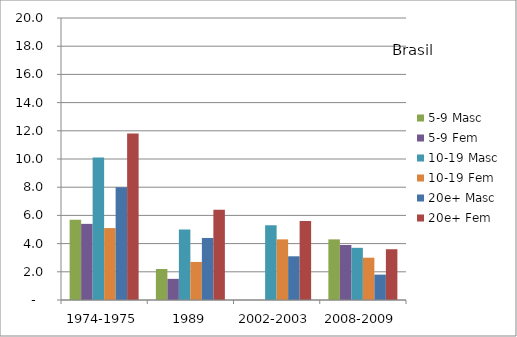
| Category | 5-9 Masc | 5-9 Fem | 10-19 Masc | 10-19 Fem | 20e+ Masc | 20e+ Fem |
|---|---|---|---|---|---|---|
| 1974-1975 | 5.7 | 5.4 | 10.1 | 5.1 | 8 | 11.8 |
| 1989 | 2.2 | 1.5 | 5 | 2.7 | 4.4 | 6.4 |
| 2002-2003 | 0 | 0 | 5.3 | 4.3 | 3.1 | 5.6 |
| 2008-2009 | 4.3 | 3.9 | 3.7 | 3 | 1.8 | 3.6 |